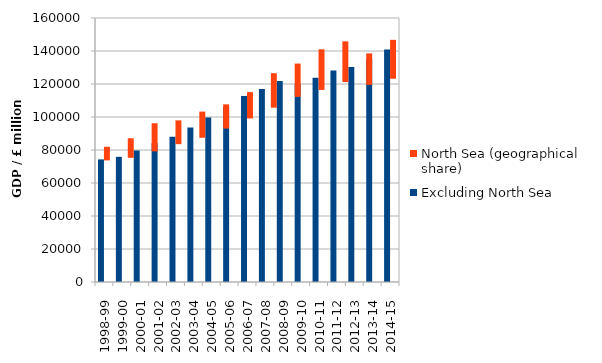
| Category | Excluding North Sea | North Sea (geographical share) |
|---|---|---|
| 1998-99 | 74303 | 7643 |
| 1999-00 | 75867 | 11258 |
| 2000-01 | 79756 | 16457 |
| 2001-02 | 84144 | 13830 |
| 2002-03 | 88028 | 15253 |
| 2003-04 | 93589 | 14087 |
| 2004-05 | 99727 | 15346 |
| 2005-06 | 106260 | 20287 |
| 2006-07 | 112793 | 19590 |
| 2007-08 | 117006 | 24030 |
| 2008-09 | 121815 | 24038 |
| 2009-10 | 120076 | 18460 |
| 2010-11 | 123800 | 22958 |
| 2011-12 | 128177 | 23631 |
| 2012-13 | 130363 | 19327 |
| 2013-14 | 135317 | 18273 |
| 2014-15 | 140854 | 12675 |